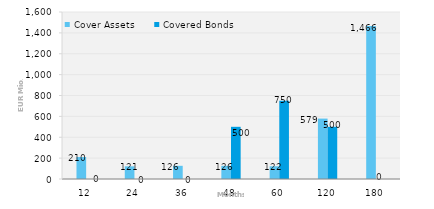
| Category | Cover Assets | Covered Bonds |
|---|---|---|
| 12.0 | 210.194 | 0 |
| 24.0 | 121.339 | 0 |
| 36.0 | 126.399 | 0 |
| 48.0 | 125.969 | 500 |
| 60.0 | 121.846 | 750 |
| 120.0 | 578.733 | 500 |
| 180.0 | 1465.645 | 0 |